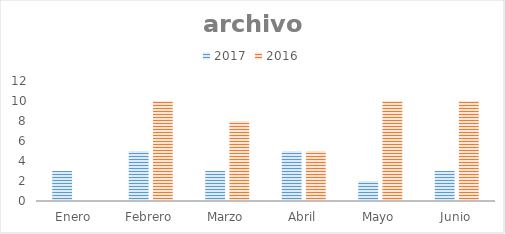
| Category | 2017 | 2016 |
|---|---|---|
| Enero | 3 | 0 |
| Febrero | 5 | 10 |
| Marzo | 3 | 8 |
| Abril | 5 | 5 |
| Mayo | 2 | 10 |
| Junio | 3 | 10 |